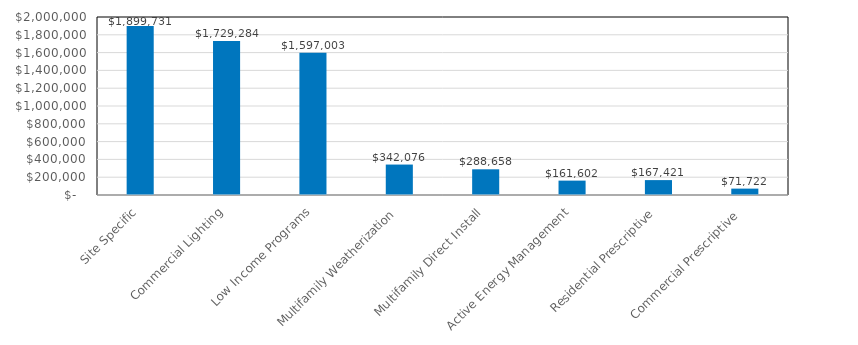
| Category | Series 0 |
|---|---|
| Site Specific | 1899730.664 |
| Commercial Lighting | 1729283.923 |
| Low Income Programs | 1597003.189 |
| Multifamily Weatherization | 342076.039 |
| Multifamily Direct Install | 288657.989 |
| Active Energy Management | 161601.843 |
| Residential Prescriptive | 167420.565 |
| Commercial Prescriptive  | 71722.234 |